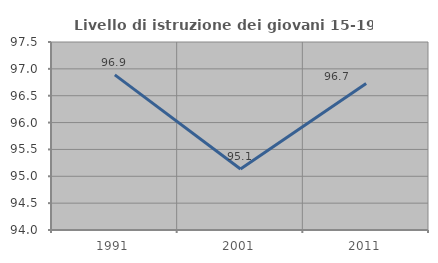
| Category | Livello di istruzione dei giovani 15-19 anni |
|---|---|
| 1991.0 | 96.889 |
| 2001.0 | 95.135 |
| 2011.0 | 96.729 |